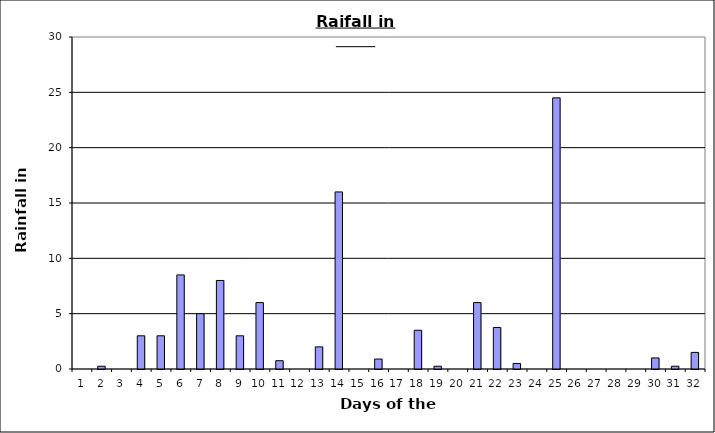
| Category | Series 0 |
|---|---|
| 0 | 0 |
| 1 | 0.25 |
| 2 | 0 |
| 3 | 3 |
| 4 | 3 |
| 5 | 8.5 |
| 6 | 5 |
| 7 | 8 |
| 8 | 3 |
| 9 | 6 |
| 10 | 0.75 |
| 11 | 0 |
| 12 | 2 |
| 13 | 16 |
| 14 | 0 |
| 15 | 0.9 |
| 16 | 0 |
| 17 | 3.5 |
| 18 | 0.25 |
| 19 | 0 |
| 20 | 6 |
| 21 | 3.75 |
| 22 | 0.5 |
| 23 | 0 |
| 24 | 24.5 |
| 25 | 0 |
| 26 | 0 |
| 27 | 0 |
| 28 | 0 |
| 29 | 1 |
| 30 | 0.25 |
| 31 | 1.5 |